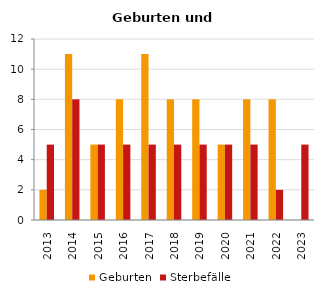
| Category | Geburten | Sterbefälle |
|---|---|---|
| 2013.0 | 2 | 5 |
| 2014.0 | 11 | 8 |
| 2015.0 | 5 | 5 |
| 2016.0 | 8 | 5 |
| 2017.0 | 11 | 5 |
| 2018.0 | 8 | 5 |
| 2019.0 | 8 | 5 |
| 2020.0 | 5 | 5 |
| 2021.0 | 8 | 5 |
| 2022.0 | 8 | 2 |
| 2023.0 | 0 | 5 |